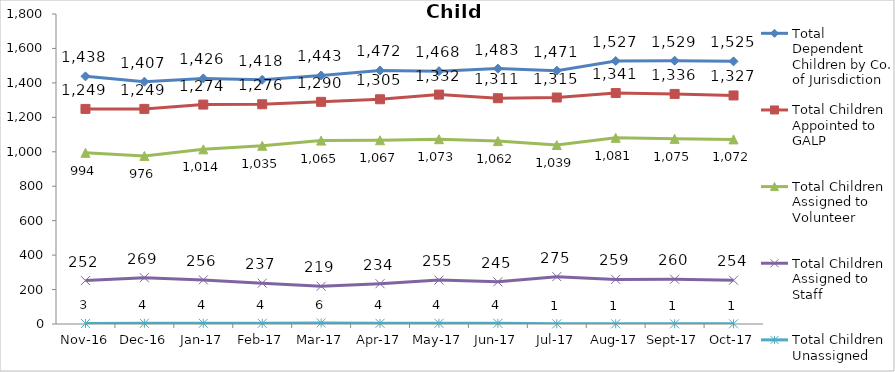
| Category | Total Dependent Children by Co. of Jurisdiction | Total Children Appointed to GALP | Total Children Assigned to Volunteer | Total Children Assigned to Staff | Total Children Unassigned |
|---|---|---|---|---|---|
| 2016-11-01 | 1438 | 1249 | 994 | 252 | 3 |
| 2016-12-01 | 1407 | 1249 | 976 | 269 | 4 |
| 2017-01-01 | 1426 | 1274 | 1014 | 256 | 4 |
| 2017-02-01 | 1418 | 1276 | 1035 | 237 | 4 |
| 2017-03-01 | 1443 | 1290 | 1065 | 219 | 6 |
| 2017-04-01 | 1472 | 1305 | 1067 | 234 | 4 |
| 2017-05-01 | 1468 | 1332 | 1073 | 255 | 4 |
| 2017-06-01 | 1483 | 1311 | 1062 | 245 | 4 |
| 2017-07-01 | 1471 | 1315 | 1039 | 275 | 1 |
| 2017-08-01 | 1527 | 1341 | 1081 | 259 | 1 |
| 2017-09-01 | 1529 | 1336 | 1075 | 260 | 1 |
| 2017-10-01 | 1525 | 1327 | 1072 | 254 | 1 |